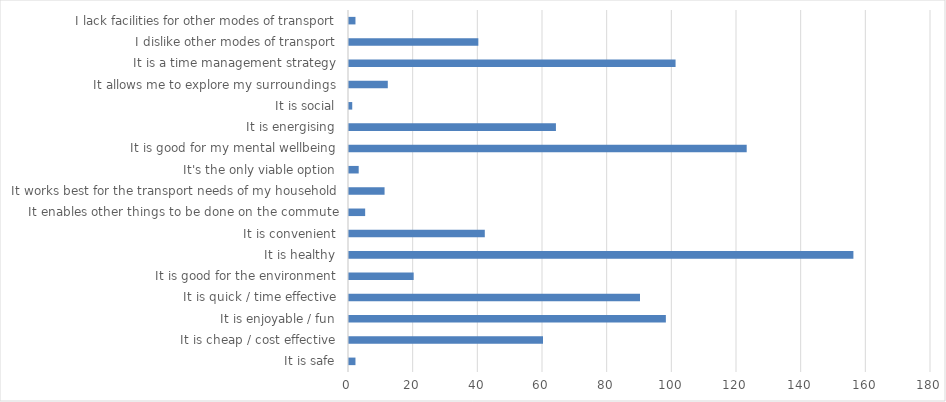
| Category | Series 0 |
|---|---|
| It is safe | 2 |
| It is cheap / cost effective | 60 |
| It is enjoyable / fun | 98 |
| It is quick / time effective | 90 |
| It is good for the environment | 20 |
| It is healthy | 156 |
| It is convenient | 42 |
| It enables other things to be done on the commute | 5 |
| It works best for the transport needs of my household | 11 |
| It's the only viable option | 3 |
| It is good for my mental wellbeing | 123 |
| It is energising | 64 |
| It is social | 1 |
| It allows me to explore my surroundings | 12 |
| It is a time management strategy | 101 |
| I dislike other modes of transport | 40 |
| I lack facilities for other modes of transport | 2 |